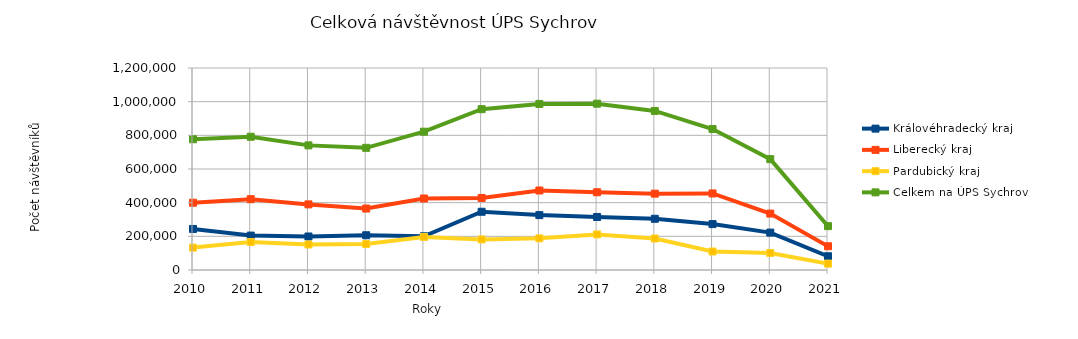
| Category | Královéhradecký kraj | Liberecký kraj | Pardubický kraj | Celkem na ÚPS Sychrov |
|---|---|---|---|---|
| 2010.0 | 243910 | 399672 | 133004 | 776586 |
| 2011.0 | 204481 | 420780 | 166238 | 791499 |
| 2012.0 | 199025 | 389781 | 151509 | 740315 |
| 2013.0 | 206419 | 365108 | 154165 | 725692 |
| 2014.0 | 200438 | 424718 | 196473 | 821629 |
| 2015.0 | 345970 | 428023 | 181567 | 955560 |
| 2016.0 | 326137 | 472318 | 188108 | 986563 |
| 2017.0 | 314983 | 461803 | 211268 | 988054 |
| 2018.0 | 304267 | 453568 | 187017 | 944852 |
| 2019.0 | 272720 | 454785 | 109949 | 837454 |
| 2020.0 | 222238 | 335261 | 101211 | 658710 |
| 2021.0 | 81733 | 141084 | 37758 | 260575 |